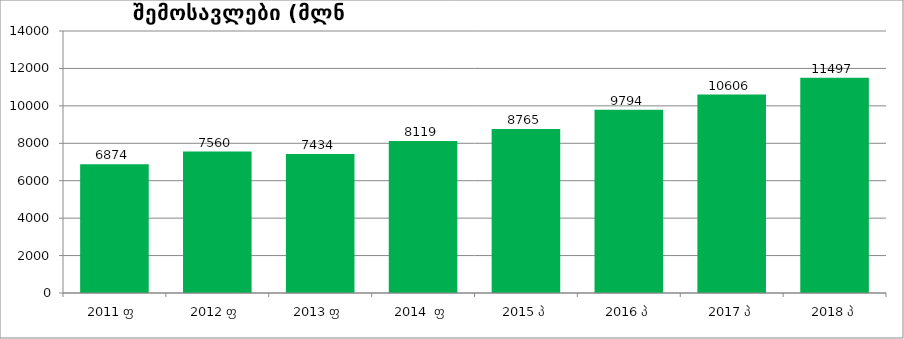
| Category | შემოსავლები (მლნ ლარებში) |
|---|---|
| 2011 ფ | 6873.661 |
| 2012 ფ | 7560.046 |
| 2013 ფ | 7434.152 |
| 2014  ფ | 8118.8 |
| 2015 პ | 8765 |
| 2016 პ | 9794 |
| 2017 პ | 10606 |
| 2018 პ | 11497 |